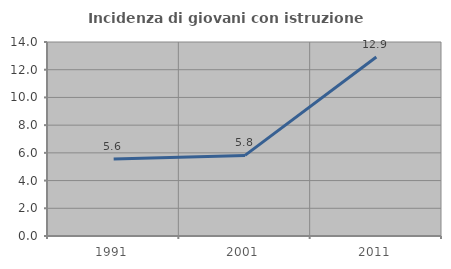
| Category | Incidenza di giovani con istruzione universitaria |
|---|---|
| 1991.0 | 5.556 |
| 2001.0 | 5.817 |
| 2011.0 | 12.919 |